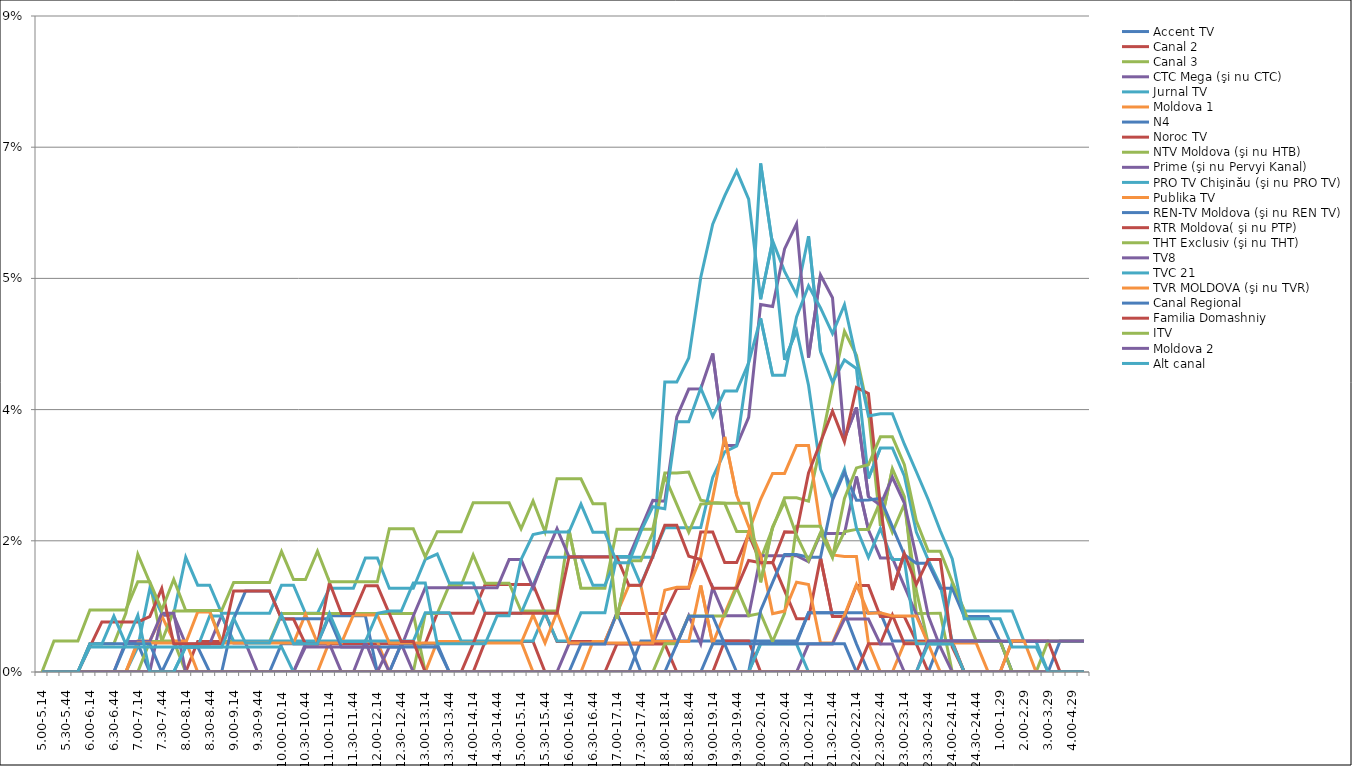
| Category | Accent TV | Canal 2 | Canal 3 | CTC Mega (şi nu CTC) | Jurnal TV | Moldova 1 | N4 | Noroc TV | NTV Moldova (şi nu HTB) | Prime (şi nu Pervyi Kanal) | PRO TV Chişinău (şi nu PRO TV) | Publika TV  | REN-TV Moldova (şi nu REN TV)  | RTR Moldova( şi nu PTP)  | THT Exclusiv (şi nu THT) | TV8 | TVC 21 | TVR MOLDOVA (şi nu TVR) | Canal Regional | Familia Domashniy | ITV | Moldova 2 | Alt canal |
|---|---|---|---|---|---|---|---|---|---|---|---|---|---|---|---|---|---|---|---|---|---|---|---|
| 5.00-5.14 | 0 | 0 | 0 | 0 | 0 | 0 | 0 | 0 | 0 | 0 | 0 | 0 | 0 | 0 | 0 | 0 | 0 | 0 | 0 | 0 | 0 | 0 | 0 |
| 5.15-5.29 | 0 | 0 | 0 | 0 | 0 | 0 | 0 | 0 | 0 | 0 | 0 | 0 | 0 | 0 | 0.004 | 0 | 0 | 0 | 0 | 0 | 0 | 0 | 0 |
| 5.30-5.44 | 0 | 0 | 0 | 0 | 0 | 0 | 0 | 0 | 0 | 0 | 0 | 0 | 0 | 0 | 0.004 | 0 | 0 | 0 | 0 | 0 | 0 | 0 | 0 |
| 5.45-5.59 | 0 | 0 | 0 | 0 | 0 | 0 | 0 | 0 | 0 | 0 | 0 | 0 | 0 | 0 | 0.004 | 0 | 0 | 0 | 0 | 0 | 0 | 0 | 0 |
| 6.00-6.14 | 0 | 0 | 0.004 | 0 | 0 | 0 | 0.004 | 0 | 0 | 0 | 0 | 0 | 0 | 0.003 | 0.008 | 0 | 0.003 | 0 | 0 | 0 | 0 | 0 | 0.004 |
| 6.15-6.29 | 0 | 0 | 0.004 | 0 | 0 | 0 | 0.004 | 0 | 0 | 0 | 0 | 0 | 0 | 0.007 | 0.008 | 0 | 0.003 | 0 | 0 | 0 | 0 | 0 | 0.004 |
| 6.30-6.44 | 0 | 0 | 0.004 | 0 | 0 | 0 | 0.004 | 0 | 0 | 0 | 0 | 0 | 0 | 0.007 | 0.008 | 0 | 0.003 | 0 | 0 | 0 | 0 | 0 | 0.007 |
| 6.45-6.59 | 0 | 0 | 0.008 | 0 | 0 | 0 | 0.004 | 0 | 0 | 0.004 | 0 | 0 | 0.004 | 0.007 | 0.008 | 0 | 0.003 | 0 | 0 | 0 | 0 | 0 | 0.004 |
| 7.00-7.14 | 0 | 0 | 0.016 | 0 | 0.003 | 0.004 | 0.004 | 0 | 0 | 0.004 | 0 | 0.004 | 0.004 | 0.007 | 0.012 | 0 | 0.003 | 0 | 0 | 0 | 0 | 0 | 0.008 |
| 7.15-7.29 | 0 | 0 | 0.012 | 0 | 0.011 | 0.004 | 0 | 0 | 0.004 | 0.004 | 0 | 0.004 | 0.004 | 0.007 | 0.012 | 0 | 0.003 | 0 | 0 | 0 | 0 | 0 | 0 |
| 7.30-7.44 | 0 | 0 | 0.004 | 0.008 | 0.008 | 0.007 | 0 | 0 | 0.004 | 0.008 | 0 | 0.004 | 0 | 0.011 | 0.008 | 0 | 0.003 | 0 | 0 | 0 | 0 | 0 | 0 |
| 7.45-7.59 | 0 | 0 | 0.004 | 0.008 | 0.008 | 0.004 | 0 | 0 | 0.008 | 0.008 | 0 | 0.004 | 0.003 | 0.004 | 0.012 | 0 | 0.003 | 0 | 0 | 0 | 0 | 0 | 0 |
| 8.00-8.14 | 0 | 0 | 0 | 0.004 | 0.015 | 0.004 | 0 | 0 | 0.008 | 0 | 0.003 | 0.004 | 0.003 | 0.004 | 0.008 | 0 | 0.003 | 0 | 0 | 0 | 0 | 0 | 0.003 |
| 8.15-8.29 | 0 | 0.004 | 0 | 0.004 | 0.012 | 0 | 0 | 0 | 0.008 | 0 | 0.003 | 0.008 | 0.003 | 0.004 | 0.008 | 0 | 0.003 | 0 | 0 | 0 | 0 | 0 | 0.003 |
| 8.30-8.44 | 0 | 0.004 | 0 | 0.004 | 0.012 | 0 | 0 | 0 | 0.008 | 0 | 0.007 | 0.008 | 0 | 0.004 | 0.008 | 0 | 0.003 | 0 | 0 | 0 | 0 | 0 | 0.003 |
| 8.45-8.59 | 0 | 0.004 | 0 | 0.008 | 0.008 | 0 | 0 | 0 | 0.004 | 0 | 0.007 | 0.004 | 0 | 0.004 | 0.008 | 0 | 0.003 | 0 | 0 | 0 | 0 | 0 | 0.003 |
| 9.00-9.14 | 0 | 0.004 | 0 | 0.004 | 0.008 | 0 | 0 | 0 | 0.004 | 0 | 0.004 | 0.004 | 0.007 | 0.011 | 0.012 | 0 | 0.003 | 0 | 0 | 0 | 0 | 0 | 0.007 |
| 9.15-9.29 | 0 | 0.004 | 0 | 0.004 | 0.008 | 0 | 0 | 0 | 0.004 | 0 | 0.004 | 0.004 | 0.011 | 0.011 | 0.012 | 0 | 0.003 | 0 | 0 | 0 | 0 | 0 | 0.004 |
| 9.30-9.44 | 0 | 0.004 | 0 | 0 | 0.008 | 0 | 0 | 0 | 0.004 | 0 | 0.004 | 0.004 | 0.011 | 0.011 | 0.012 | 0 | 0.003 | 0 | 0 | 0 | 0 | 0 | 0.004 |
| 9.45-9.59 | 0 | 0.004 | 0 | 0 | 0.008 | 0 | 0 | 0 | 0.004 | 0 | 0.004 | 0.004 | 0.011 | 0.011 | 0.012 | 0 | 0.003 | 0 | 0 | 0 | 0 | 0 | 0.004 |
| 10.00-10.14 | 0 | 0.004 | 0 | 0 | 0.012 | 0 | 0.004 | 0 | 0.008 | 0 | 0.004 | 0.004 | 0.007 | 0.007 | 0.016 | 0 | 0.003 | 0 | 0 | 0 | 0 | 0 | 0.008 |
| 10.15-10.29 | 0 | 0.004 | 0 | 0 | 0.012 | 0 | 0.004 | 0 | 0.008 | 0 | 0.004 | 0.004 | 0.007 | 0.007 | 0.012 | 0 | 0 | 0 | 0 | 0 | 0 | 0 | 0.004 |
| 10.30-10.44 | 0 | 0.004 | 0 | 0.004 | 0.008 | 0 | 0.004 | 0 | 0.008 | 0 | 0.004 | 0.008 | 0.007 | 0.004 | 0.012 | 0.003 | 0 | 0 | 0 | 0 | 0 | 0 | 0.004 |
| 10.45-10.59 | 0 | 0.004 | 0 | 0.004 | 0.008 | 0 | 0.004 | 0 | 0.008 | 0 | 0.004 | 0.004 | 0.007 | 0.004 | 0.016 | 0.003 | 0 | 0 | 0 | 0 | 0 | 0 | 0.004 |
| 11.00-11.14 | 0 | 0.004 | 0 | 0.004 | 0.011 | 0.004 | 0.008 | 0 | 0.008 | 0 | 0.004 | 0.004 | 0.007 | 0.012 | 0.012 | 0.003 | 0 | 0 | 0 | 0 | 0 | 0 | 0.008 |
| 11.15-11.29 | 0 | 0.004 | 0 | 0 | 0.011 | 0.004 | 0.008 | 0 | 0.008 | 0 | 0.004 | 0.004 | 0.003 | 0.008 | 0.012 | 0.003 | 0 | 0 | 0 | 0 | 0 | 0 | 0.004 |
| 11.30-11.44 | 0 | 0.004 | 0 | 0 | 0.011 | 0.004 | 0.008 | 0 | 0.008 | 0 | 0.004 | 0.008 | 0.003 | 0.008 | 0.012 | 0.003 | 0 | 0 | 0 | 0 | 0 | 0 | 0.004 |
| 11.45-11.59 | 0 | 0.004 | 0 | 0.004 | 0.015 | 0.004 | 0.008 | 0 | 0.008 | 0 | 0.004 | 0.008 | 0.003 | 0.012 | 0.012 | 0.003 | 0 | 0 | 0 | 0 | 0 | 0 | 0.004 |
| 12.00-12.14 | 0 | 0.004 | 0 | 0 | 0.015 | 0.004 | 0 | 0 | 0.008 | 0 | 0.004 | 0.008 | 0.003 | 0.012 | 0.012 | 0.003 | 0 | 0 | 0 | 0 | 0 | 0 | 0.008 |
| 12.15-12.29 | 0 | 0.004 | 0 | 0 | 0.011 | 0 | 0 | 0 | 0.008 | 0.003 | 0.004 | 0.004 | 0.003 | 0.008 | 0.019 | 0 | 0 | 0 | 0 | 0 | 0 | 0 | 0.008 |
| 12.30-12.44 | 0 | 0.004 | 0 | 0.004 | 0.011 | 0 | 0.004 | 0 | 0.008 | 0.003 | 0.004 | 0.004 | 0.003 | 0.004 | 0.019 | 0 | 0 | 0 | 0 | 0 | 0 | 0 | 0.008 |
| 12.45-12.59 | 0 | 0.004 | 0 | 0 | 0.011 | 0 | 0.004 | 0 | 0.008 | 0.007 | 0.004 | 0.004 | 0.003 | 0.004 | 0.019 | 0 | 0 | 0 | 0 | 0 | 0 | 0 | 0.012 |
| 13.00-13.14 | 0 | 0.004 | 0.008 | 0 | 0.015 | 0 | 0.004 | 0 | 0 | 0.011 | 0.008 | 0.004 | 0.003 | 0 | 0.015 | 0 | 0 | 0 | 0 | 0 | 0 | 0 | 0.012 |
| 13.15-13.29 | 0 | 0.008 | 0.008 | 0 | 0.016 | 0.004 | 0.004 | 0 | 0 | 0.011 | 0.008 | 0.004 | 0.003 | 0 | 0.019 | 0 | 0 | 0 | 0 | 0 | 0 | 0 | 0.004 |
| 13.30-13.44 | 0 | 0.008 | 0.012 | 0 | 0.012 | 0.004 | 0 | 0 | 0 | 0.011 | 0.008 | 0.004 | 0 | 0 | 0.019 | 0 | 0 | 0 | 0 | 0 | 0 | 0 | 0.004 |
| 13.45-13.59 | 0 | 0.008 | 0.012 | 0 | 0.012 | 0.004 | 0 | 0 | 0 | 0.011 | 0.004 | 0.004 | 0 | 0 | 0.019 | 0 | 0 | 0 | 0 | 0 | 0 | 0 | 0.004 |
| 14.00-14.14 | 0 | 0.008 | 0.016 | 0 | 0.012 | 0.004 | 0 | 0 | 0 | 0.011 | 0.004 | 0.004 | 0 | 0.004 | 0.023 | 0 | 0 | 0 | 0 | 0 | 0 | 0 | 0.004 |
| 14.15-14.29 | 0 | 0.012 | 0.012 | 0 | 0.008 | 0.004 | 0 | 0.004 | 0 | 0.011 | 0.004 | 0.004 | 0 | 0.008 | 0.023 | 0 | 0 | 0 | 0 | 0 | 0 | 0 | 0.004 |
| 14.30-14.44 | 0 | 0.012 | 0.012 | 0 | 0.008 | 0.004 | 0 | 0.004 | 0 | 0.011 | 0.004 | 0.004 | 0 | 0.008 | 0.023 | 0 | 0 | 0 | 0 | 0 | 0 | 0 | 0.008 |
| 14.45-14.59 | 0 | 0.012 | 0.012 | 0 | 0.008 | 0.004 | 0 | 0.004 | 0 | 0.015 | 0.004 | 0.004 | 0 | 0.008 | 0.023 | 0 | 0 | 0 | 0 | 0 | 0 | 0 | 0.008 |
| 15.00-15.14 | 0 | 0.012 | 0.008 | 0 | 0.008 | 0.004 | 0 | 0.004 | 0 | 0.015 | 0.004 | 0.004 | 0 | 0.008 | 0.019 | 0 | 0 | 0 | 0 | 0 | 0 | 0 | 0.015 |
| 15.15-15.29 | 0 | 0.012 | 0.008 | 0 | 0.012 | 0 | 0 | 0.004 | 0 | 0.011 | 0.004 | 0.008 | 0 | 0.008 | 0.023 | 0 | 0 | 0 | 0 | 0 | 0 | 0 | 0.018 |
| 15.30-15.44 | 0 | 0.008 | 0.008 | 0 | 0.015 | 0 | 0 | 0 | 0 | 0.015 | 0.008 | 0.004 | 0 | 0.008 | 0.019 | 0 | 0 | 0 | 0 | 0 | 0 | 0 | 0.019 |
| 15.45-15.59 | 0 | 0.004 | 0.008 | 0 | 0.015 | 0 | 0 | 0 | 0 | 0.019 | 0.004 | 0.008 | 0 | 0.008 | 0.026 | 0 | 0 | 0 | 0 | 0 | 0 | 0 | 0.019 |
| 16.00-16.14 | 0 | 0.004 | 0.019 | 0.004 | 0.015 | 0 | 0 | 0 | 0 | 0.015 | 0.004 | 0.004 | 0 | 0.015 | 0.026 | 0 | 0 | 0 | 0 | 0 | 0 | 0 | 0.019 |
| 16.15-16.29 | 0 | 0.004 | 0.011 | 0.004 | 0.015 | 0 | 0 | 0 | 0 | 0.015 | 0.008 | 0.004 | 0.004 | 0.015 | 0.026 | 0 | 0 | 0 | 0 | 0 | 0 | 0 | 0.022 |
| 16.30-16.44 | 0 | 0.004 | 0.011 | 0.004 | 0.012 | 0.004 | 0 | 0 | 0 | 0.015 | 0.008 | 0.004 | 0.004 | 0.015 | 0.022 | 0 | 0 | 0 | 0 | 0 | 0 | 0 | 0.019 |
| 16.45-16.59 | 0 | 0.004 | 0.011 | 0.004 | 0.012 | 0.004 | 0 | 0 | 0 | 0.015 | 0.008 | 0.004 | 0.004 | 0.015 | 0.022 | 0 | 0 | 0 | 0 | 0 | 0 | 0 | 0.019 |
| 17.00-17.14 | 0 | 0.008 | 0.019 | 0.004 | 0.015 | 0.008 | 0 | 0.004 | 0 | 0.015 | 0.015 | 0.004 | 0.008 | 0.015 | 0.007 | 0 | 0 | 0 | 0 | 0 | 0 | 0 | 0.015 |
| 17.15-17.29 | 0 | 0.008 | 0.019 | 0.004 | 0.015 | 0.012 | 0 | 0.004 | 0 | 0.015 | 0.015 | 0.004 | 0.004 | 0.012 | 0.015 | 0 | 0 | 0 | 0 | 0 | 0 | 0 | 0.015 |
| 17.30-17.44 | 0.004 | 0.008 | 0.019 | 0.004 | 0.015 | 0.012 | 0 | 0.004 | 0 | 0.019 | 0.012 | 0.004 | 0 | 0.012 | 0.015 | 0 | 0 | 0 | 0 | 0 | 0 | 0 | 0.019 |
| 17.45-17.59 | 0.004 | 0.008 | 0.019 | 0.004 | 0.015 | 0.004 | 0 | 0.004 | 0 | 0.023 | 0.016 | 0.004 | 0 | 0.015 | 0.019 | 0 | 0 | 0 | 0 | 0 | 0 | 0 | 0.022 |
| 18.00-18.14 | 0.004 | 0.008 | 0.027 | 0.008 | 0.039 | 0.004 | 0 | 0.004 | 0.004 | 0.023 | 0.019 | 0.011 | 0 | 0.02 | 0.026 | 0 | 0 | 0 | 0 | 0 | 0 | 0 | 0.022 |
| 18.15-18.29 | 0.004 | 0.011 | 0.027 | 0.004 | 0.039 | 0.004 | 0 | 0 | 0.004 | 0.034 | 0.019 | 0.011 | 0.004 | 0.02 | 0.022 | 0 | 0 | 0 | 0 | 0 | 0 | 0 | 0.033 |
| 18.30-18.44 | 0.004 | 0.011 | 0.027 | 0.008 | 0.042 | 0.004 | 0 | 0 | 0.007 | 0.038 | 0.019 | 0.011 | 0.007 | 0.015 | 0.019 | 0 | 0 | 0 | 0 | 0 | 0 | 0 | 0.033 |
| 18.45-18.59 | 0.004 | 0.019 | 0.023 | 0.004 | 0.053 | 0.012 | 0 | 0 | 0.007 | 0.038 | 0.019 | 0.015 | 0.007 | 0.015 | 0.022 | 0 | 0 | 0 | 0 | 0 | 0 | 0 | 0.038 |
| 19.00-19.14 | 0.004 | 0.019 | 0.023 | 0.011 | 0.06 | 0.004 | 0 | 0 | 0.007 | 0.042 | 0.026 | 0.023 | 0.007 | 0.011 | 0.022 | 0 | 0 | 0 | 0.004 | 0 | 0 | 0 | 0.034 |
| 19.15-19.29 | 0.004 | 0.015 | 0.023 | 0.008 | 0.063 | 0.008 | 0 | 0.004 | 0.007 | 0.03 | 0.029 | 0.031 | 0.004 | 0.011 | 0.022 | 0 | 0 | 0 | 0.004 | 0 | 0 | 0 | 0.037 |
| 19.30-19.44 | 0.004 | 0.015 | 0.019 | 0.008 | 0.067 | 0.012 | 0 | 0.004 | 0.011 | 0.03 | 0.03 | 0.024 | 0 | 0.011 | 0.022 | 0 | 0 | 0 | 0.004 | 0 | 0 | 0 | 0.037 |
| 19.45-19.59 | 0.004 | 0.018 | 0.019 | 0.008 | 0.063 | 0.019 | 0 | 0.004 | 0.008 | 0.034 | 0.041 | 0.019 | 0 | 0.015 | 0.022 | 0 | 0 | 0 | 0.004 | 0 | 0 | 0 | 0.041 |
| 20.00-20.14 | 0.004 | 0.015 | 0.015 | 0.016 | 0.05 | 0.023 | 0.004 | 0 | 0.008 | 0.049 | 0.068 | 0.016 | 0.008 | 0.015 | 0.012 | 0 | 0.004 | 0 | 0.004 | 0 | 0 | 0 | 0.047 |
| 20.15-20.29 | 0.004 | 0.015 | 0.019 | 0.016 | 0.058 | 0.026 | 0.004 | 0 | 0.004 | 0.049 | 0.057 | 0.008 | 0.012 | 0.015 | 0.019 | 0 | 0.004 | 0 | 0.004 | 0 | 0 | 0 | 0.04 |
| 20.30-20.44 | 0.004 | 0.011 | 0.023 | 0.016 | 0.053 | 0.026 | 0.004 | 0 | 0.008 | 0.056 | 0.042 | 0.008 | 0.016 | 0.019 | 0.023 | 0 | 0.004 | 0 | 0.004 | 0 | 0 | 0 | 0.04 |
| 20.45-20.59 | 0.004 | 0.007 | 0.023 | 0.016 | 0.05 | 0.03 | 0.004 | 0 | 0.019 | 0.06 | 0.046 | 0.012 | 0.016 | 0.019 | 0.018 | 0 | 0.004 | 0 | 0.004 | 0 | 0 | 0 | 0.047 |
| 21.00-21.14 | 0.008 | 0.007 | 0.023 | 0.015 | 0.058 | 0.03 | 0.008 | 0 | 0.019 | 0.042 | 0.038 | 0.012 | 0.015 | 0.027 | 0.015 | 0.004 | 0 | 0 | 0.004 | 0 | 0 | 0 | 0.052 |
| 21.15-21.29 | 0.008 | 0.015 | 0.03 | 0.018 | 0.043 | 0.019 | 0.008 | 0 | 0.019 | 0.053 | 0.027 | 0.004 | 0.015 | 0.031 | 0.019 | 0.004 | 0 | 0 | 0.004 | 0 | 0 | 0 | 0.049 |
| 21.30-21.44 | 0.008 | 0.007 | 0.038 | 0.018 | 0.039 | 0.016 | 0.008 | 0 | 0.015 | 0.05 | 0.023 | 0.004 | 0.023 | 0.035 | 0.015 | 0.004 | 0 | 0 | 0.004 | 0 | 0 | 0 | 0.045 |
| 21.45-21.59 | 0.008 | 0.007 | 0.045 | 0.018 | 0.042 | 0.015 | 0.008 | 0 | 0.019 | 0.031 | 0.027 | 0.008 | 0.027 | 0.031 | 0.023 | 0.007 | 0 | 0 | 0.004 | 0 | 0 | 0 | 0.049 |
| 22.00-22.14 | 0.008 | 0.012 | 0.042 | 0.026 | 0.04 | 0.015 | 0.004 | 0 | 0.019 | 0.035 | 0.019 | 0.012 | 0.023 | 0.038 | 0.027 | 0.007 | 0 | 0 | 0 | 0 | 0 | 0 | 0.042 |
| 22.15-22.29 | 0.008 | 0.012 | 0.035 | 0.019 | 0.026 | 0.004 | 0 | 0.004 | 0.019 | 0.023 | 0.015 | 0.008 | 0.023 | 0.037 | 0.028 | 0.007 | 0 | 0 | 0 | 0 | 0 | 0 | 0.034 |
| 22.30-22.44 | 0.008 | 0.007 | 0.02 | 0.015 | 0.03 | 0 | 0 | 0.004 | 0.023 | 0.022 | 0.019 | 0.008 | 0.023 | 0.022 | 0.031 | 0.004 | 0 | 0 | 0 | 0 | 0 | 0 | 0.034 |
| 22.45-22.59 | 0.004 | 0.007 | 0.027 | 0.015 | 0.03 | 0 | 0 | 0.008 | 0.019 | 0.026 | 0.015 | 0.007 | 0.019 | 0.011 | 0.031 | 0.004 | 0 | 0 | 0 | 0 | 0 | 0 | 0.034 |
| 23.00-23.14 | 0.004 | 0.007 | 0.023 | 0.011 | 0.026 | 0.004 | 0 | 0.004 | 0.022 | 0.023 | 0.015 | 0.007 | 0.016 | 0.016 | 0.028 | 0 | 0 | 0 | 0 | 0 | 0 | 0 | 0.03 |
| 23.15-23.29 | 0.004 | 0.004 | 0.008 | 0.008 | 0.019 | 0.004 | 0 | 0.004 | 0.011 | 0.015 | 0.004 | 0.007 | 0.014 | 0.012 | 0.02 | 0 | 0 | 0 | 0 | 0 | 0 | 0 | 0.027 |
| 23.30-23.44 | 0.004 | 0.004 | 0.008 | 0.004 | 0.015 | 0.004 | 0 | 0 | 0.004 | 0.007 | 0.004 | 0.004 | 0.014 | 0.015 | 0.016 | 0.004 | 0.004 | 0 | 0 | 0 | 0 | 0 | 0.023 |
| 23.45-23.59 | 0.004 | 0.004 | 0.008 | 0.004 | 0.012 | 0.004 | 0.004 | 0 | 0.004 | 0.003 | 0.004 | 0 | 0.011 | 0.015 | 0.016 | 0.004 | 0.004 | 0 | 0 | 0 | 0 | 0 | 0.019 |
| 24.00-24.14 | 0.004 | 0.004 | 0 | 0.004 | 0.004 | 0.004 | 0.004 | 0 | 0.004 | 0 | 0.012 | 0 | 0.011 | 0.003 | 0.012 | 0.004 | 0.004 | 0 | 0 | 0 | 0 | 0 | 0.015 |
| 24.15-24.29 | 0.004 | 0 | 0 | 0 | 0.004 | 0.004 | 0.004 | 0 | 0 | 0 | 0.008 | 0 | 0.007 | 0 | 0.008 | 0.004 | 0 | 0 | 0 | 0 | 0 | 0 | 0.007 |
| 24.30-24.44 | 0.004 | 0 | 0 | 0 | 0.004 | 0.004 | 0.004 | 0 | 0 | 0 | 0.008 | 0 | 0.007 | 0 | 0.004 | 0.004 | 0 | 0 | 0 | 0 | 0 | 0 | 0.007 |
| 24.45-24.59 | 0.004 | 0 | 0 | 0 | 0.004 | 0 | 0.004 | 0 | 0 | 0 | 0.008 | 0 | 0.007 | 0 | 0.004 | 0.004 | 0 | 0 | 0 | 0 | 0 | 0 | 0.007 |
| 1.00-1.29 | 0.004 | 0 | 0 | 0 | 0.004 | 0 | 0.004 | 0 | 0 | 0 | 0.008 | 0 | 0.004 | 0 | 0.004 | 0.004 | 0 | 0 | 0 | 0 | 0 | 0 | 0.007 |
| 1.30-1. 59 | 0 | 0 | 0 | 0 | 0.004 | 0 | 0 | 0.004 | 0 | 0 | 0.008 | 0 | 0.004 | 0 | 0 | 0.004 | 0 | 0.004 | 0 | 0 | 0 | 0 | 0.003 |
| 2.00-2.29 | 0 | 0 | 0 | 0 | 0.004 | 0 | 0 | 0.004 | 0 | 0 | 0.004 | 0 | 0.004 | 0 | 0 | 0.004 | 0 | 0.004 | 0 | 0 | 0 | 0 | 0.003 |
| 2.30-2.59 | 0 | 0 | 0 | 0 | 0.004 | 0 | 0 | 0.004 | 0 | 0 | 0.004 | 0 | 0.004 | 0 | 0 | 0.004 | 0 | 0 | 0 | 0 | 0 | 0 | 0.003 |
| 3.00-3.29 | 0 | 0 | 0 | 0 | 0 | 0 | 0 | 0.004 | 0 | 0 | 0.004 | 0 | 0.004 | 0 | 0.004 | 0.004 | 0 | 0 | 0 | 0 | 0 | 0 | 0 |
| 3.30-3.59 | 0 | 0 | 0 | 0 | 0 | 0 | 0.004 | 0 | 0 | 0 | 0.004 | 0 | 0.004 | 0 | 0.004 | 0.004 | 0 | 0 | 0 | 0 | 0 | 0 | 0 |
| 4.00-4.29 | 0 | 0 | 0 | 0 | 0 | 0 | 0.004 | 0 | 0 | 0 | 0.004 | 0 | 0.004 | 0 | 0.004 | 0.004 | 0 | 0 | 0 | 0 | 0 | 0 | 0 |
| 4.30-4.59 | 0 | 0 | 0 | 0 | 0 | 0 | 0.004 | 0 | 0 | 0 | 0.004 | 0 | 0.004 | 0 | 0.004 | 0.004 | 0 | 0 | 0 | 0 | 0 | 0 | 0 |